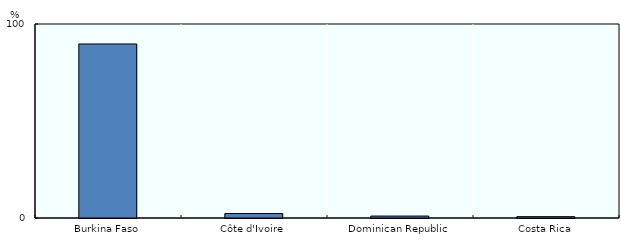
| Category | Series 0 |
|---|---|
| Burkina Faso | 89.7 |
| Côte d'Ivoire | 2.3 |
| Dominican Republic | 1 |
| Costa Rica | 0.7 |